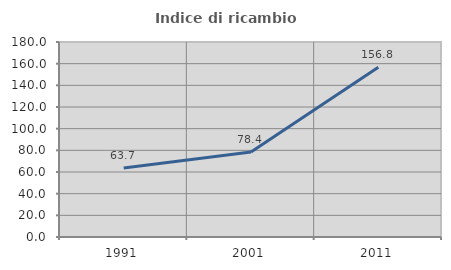
| Category | Indice di ricambio occupazionale  |
|---|---|
| 1991.0 | 63.69 |
| 2001.0 | 78.416 |
| 2011.0 | 156.805 |